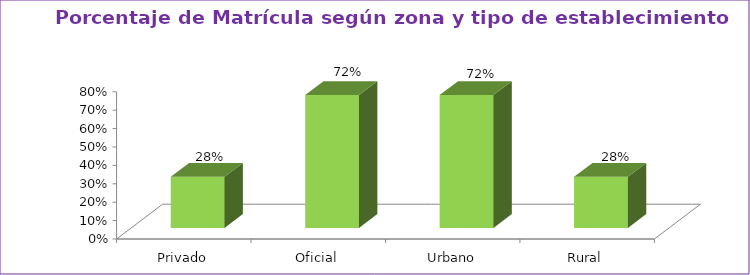
| Category | Series 1 |
|---|---|
| Privado | 0.278 |
| Oficial | 0.722 |
| Urbano | 0.722 |
| Rural | 0.278 |